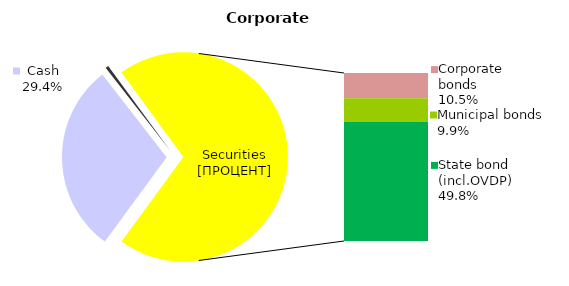
| Category | Corporate |
|---|---|
| Cash | 95.391 |
| Bank metals | 0 |
| Real estate | 0 |
| Other assets | 1.553 |
| Equities | 0.022 |
| Corporate bonds | 34.061 |
| Municipal bonds | 31.955 |
| State bond (incl.OVDP) | 161.379 |